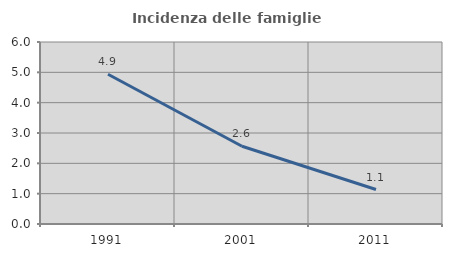
| Category | Incidenza delle famiglie numerose |
|---|---|
| 1991.0 | 4.938 |
| 2001.0 | 2.564 |
| 2011.0 | 1.136 |